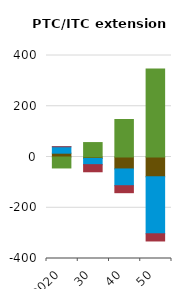
| Category | Coal | Gas & oil | Nuclear | Renewables |
|---|---|---|---|---|
| 2020.0 | 15.035 | 25.328 | 0.014 | -43.199 |
| 30.0 | -5.806 | -24.378 | -28.011 | 56.877 |
| 40.0 | -47.105 | -66.028 | -27.513 | 147.863 |
| 50.0 | -78.167 | -224.383 | -28.361 | 347.11 |